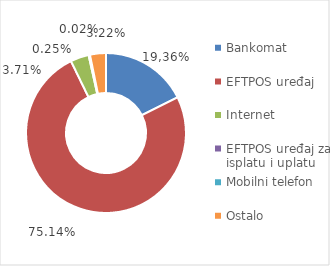
| Category | Broj transakcija |
|---|---|
| Bankomat | 99164410 |
| EFTPOS uređaj | 422057123 |
| Internet | 20858591 |
| EFTPOS uređaj za isplatu i uplatu | 1429639 |
| Mobilni telefon | 120593 |
| Ostalo | 18098024 |